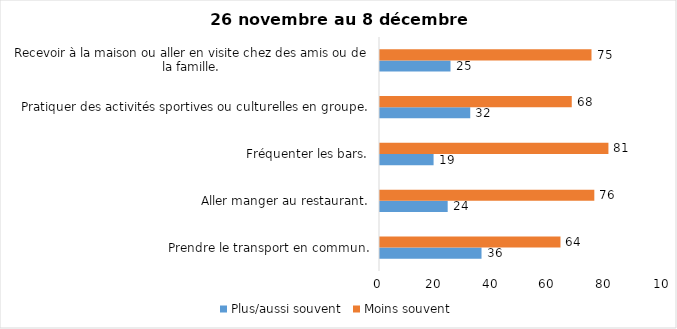
| Category | Plus/aussi souvent | Moins souvent |
|---|---|---|
| Prendre le transport en commun. | 36 | 64 |
| Aller manger au restaurant. | 24 | 76 |
| Fréquenter les bars. | 19 | 81 |
| Pratiquer des activités sportives ou culturelles en groupe. | 32 | 68 |
| Recevoir à la maison ou aller en visite chez des amis ou de la famille. | 25 | 75 |